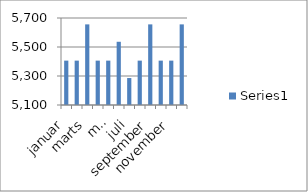
| Category | Series 0 |
|---|---|
| januar | 5406 |
| februar | 5406 |
| marts | 5656 |
| april | 5406 |
| maj | 5406 |
| juni | 5536 |
| juli | 5286 |
| august | 5406 |
| september | 5656 |
| oktober | 5406 |
| november | 5406 |
| december | 5656 |